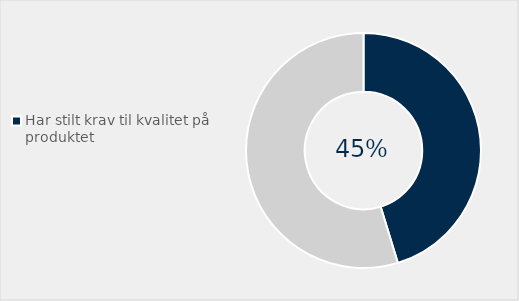
| Category | Series 0 |
|---|---|
| Har stilt krav til kvalitet på produktet | 0.453 |
| Har ikke stilt krav til sirkulær økonomi | 0.547 |